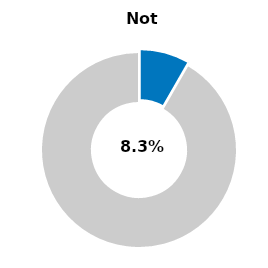
| Category | Series 0 |
|---|---|
| Not passed | 0.083 |
| Other | 0.917 |